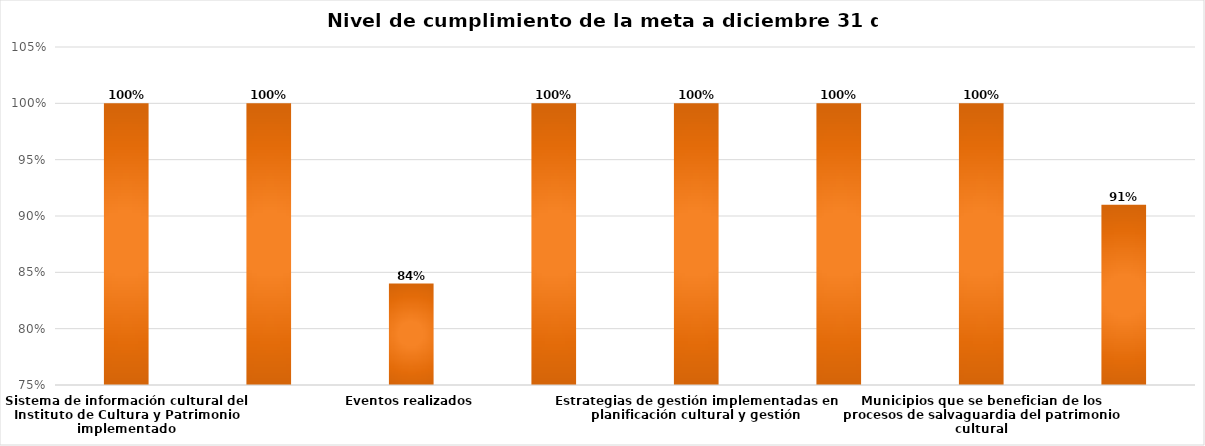
| Category | Nivel de cumplimiento de la meta a diciembre 31 de 2020 |
|---|---|
| Sistema de información cultural del Instituto de Cultura y Patrimonio implementado | 1 |
| Actores sociales formados en artes y otras manifestaciones | 1 |
| Eventos realizados | 0.84 |
| Convocatorias y propuestas de estímulos para el arte y la cultura realizadas | 1 |
| Estrategias de gestión implementadas en planificación cultural y gestión | 1 |
| Bibliotecas públicas municipales y escolares que participan en procesos de lectura y escritura | 1 |
| Municipios que se benefician de los procesos de salvaguardia del patrimonio cultural | 1 |
| Estrategia tecnológica del Instituto de Cultura y Patrimonio implementada | 0.91 |